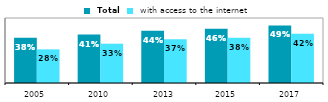
| Category |  Total |  with access to the internet |
|---|---|---|
| 2005 | 0.383 | 0.285 |
| 2010 | 0.41 | 0.333 |
|  2013 | 0.443 | 0.369 |
| 2015 | 0.459 | 0.383 |
| 2017 | 0.487 | 0.416 |